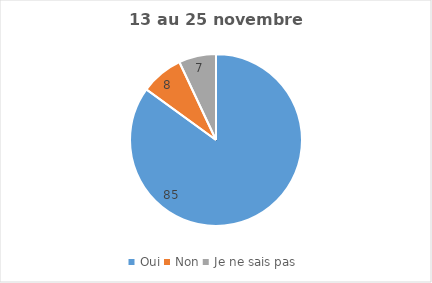
| Category | Series 0 |
|---|---|
| Oui | 85 |
| Non | 8 |
| Je ne sais pas | 7 |